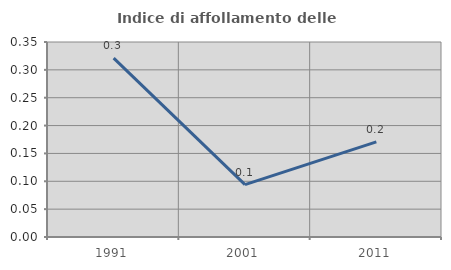
| Category | Indice di affollamento delle abitazioni  |
|---|---|
| 1991.0 | 0.321 |
| 2001.0 | 0.094 |
| 2011.0 | 0.171 |